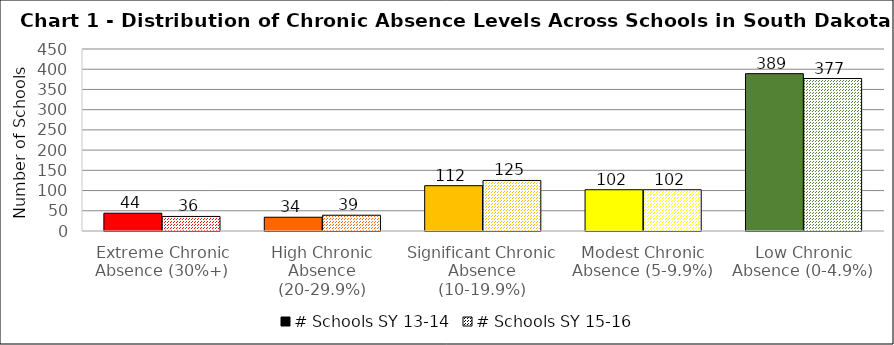
| Category | # Schools SY 13-14 | # Schools SY 15-16 |
|---|---|---|
| Extreme Chronic Absence (30%+) | 44 | 36 |
| High Chronic Absence (20-29.9%) | 34 | 39 |
| Significant Chronic Absence (10-19.9%) | 112 | 125 |
| Modest Chronic Absence (5-9.9%) | 102 | 102 |
| Low Chronic Absence (0-4.9%) | 389 | 377 |